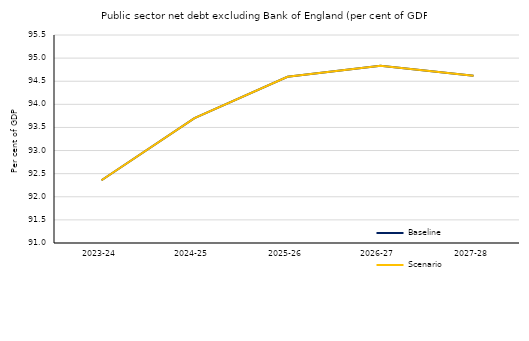
| Category | Baseline | Scenario |
|---|---|---|
| 2023-24 | 92.357 | 92.357 |
| 2024-25 | 93.7 | 93.7 |
| 2025-26 | 94.595 | 94.595 |
| 2026-27 | 94.835 | 94.835 |
| 2027-28 | 94.619 | 94.619 |